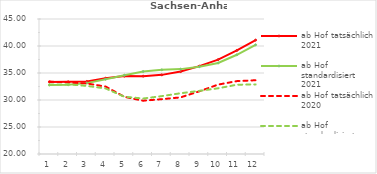
| Category | ab Hof tatsächlich 2021 | ab Hof standardisiert 2021 | ab Hof tatsächlich 2020 | ab Hof standardisiert 2020 |
|---|---|---|---|---|
| 0 | 33.346 | 32.763 | 33.415 | 32.854 |
| 1 | 33.375 | 32.819 | 33.273 | 32.898 |
| 2 | 33.435 | 33.125 | 33.057 | 32.61 |
| 3 | 34.027 | 33.853 | 32.49 | 32.142 |
| 4 | 34.421 | 34.6 | 30.587 | 30.601 |
| 5 | 34.42 | 35.265 | 29.869 | 30.272 |
| 6 | 34.654 | 35.586 | 30.156 | 30.719 |
| 7 | 35.262 | 35.718 | 30.486 | 31.249 |
| 8 | 36.266 | 36.174 | 31.609 | 31.693 |
| 9 | 37.484 | 36.85 | 32.854 | 32.168 |
| 10 | 39.179 | 38.373 | 33.495 | 32.829 |
| 11 | 41.097 | 40.22 | 33.658 | 32.89 |